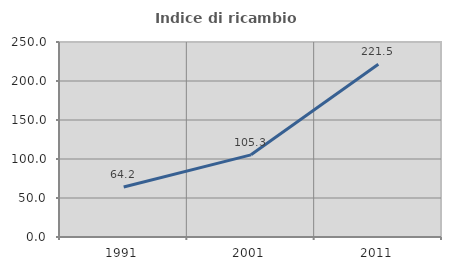
| Category | Indice di ricambio occupazionale  |
|---|---|
| 1991.0 | 64.158 |
| 2001.0 | 105.34 |
| 2011.0 | 221.549 |